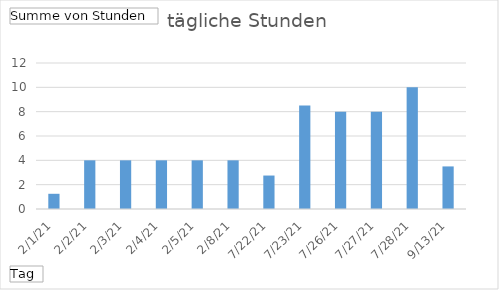
| Category | Total |
|---|---|
| 2/1/21 | 1.25 |
| 2/2/21 | 4 |
| 2/3/21 | 4 |
| 2/4/21 | 4 |
| 2/5/21 | 4 |
| 2/8/21 | 4 |
| 7/22/21 | 2.75 |
| 7/23/21 | 8.5 |
| 7/26/21 | 8 |
| 7/27/21 | 8 |
| 7/28/21 | 10 |
| 9/13/21 | 3.5 |